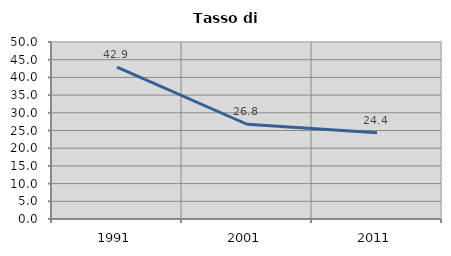
| Category | Tasso di disoccupazione   |
|---|---|
| 1991.0 | 42.901 |
| 2001.0 | 26.765 |
| 2011.0 | 24.387 |